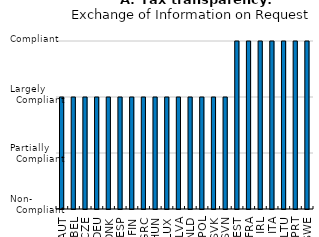
| Category | Series 0 |
|---|---|
| AUT | 4 |
| BEL | 4 |
| CZE | 4 |
| DEU | 4 |
| DNK | 4 |
| ESP | 4 |
| FIN | 4 |
| GRC | 4 |
| HUN | 4 |
| LUX | 4 |
| LVA | 4 |
| NLD | 4 |
| POL | 4 |
| SVK | 4 |
| SVN | 4 |
| EST | 6 |
| FRA | 6 |
| IRL | 6 |
| ITA | 6 |
| LTU | 6 |
| PRT | 6 |
| SWE | 6 |